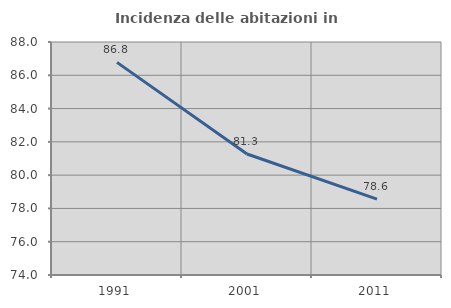
| Category | Incidenza delle abitazioni in proprietà  |
|---|---|
| 1991.0 | 86.777 |
| 2001.0 | 81.27 |
| 2011.0 | 78.564 |